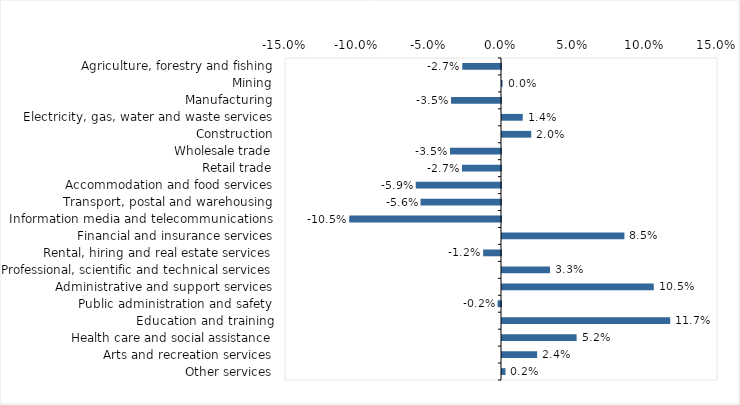
| Category | This week |
|---|---|
| Agriculture, forestry and fishing | -0.027 |
| Mining | 0 |
| Manufacturing | -0.035 |
| Electricity, gas, water and waste services | 0.014 |
| Construction | 0.02 |
| Wholesale trade | -0.035 |
| Retail trade | -0.027 |
| Accommodation and food services | -0.059 |
| Transport, postal and warehousing | -0.056 |
| Information media and telecommunications | -0.105 |
| Financial and insurance services | 0.085 |
| Rental, hiring and real estate services | -0.012 |
| Professional, scientific and technical services | 0.033 |
| Administrative and support services | 0.105 |
| Public administration and safety | -0.002 |
| Education and training | 0.117 |
| Health care and social assistance | 0.052 |
| Arts and recreation services | 0.024 |
| Other services | 0.002 |